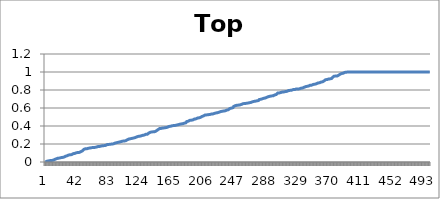
| Category | Top Slice |
|---|---|
| 0 | 0 |
| 1 | 0.006 |
| 2 | 0.009 |
| 3 | 0.01 |
| 4 | 0.012 |
| 5 | 0.014 |
| 6 | 0.015 |
| 7 | 0.017 |
| 8 | 0.017 |
| 9 | 0.019 |
| 10 | 0.02 |
| 11 | 0.022 |
| 12 | 0.028 |
| 13 | 0.029 |
| 14 | 0.036 |
| 15 | 0.036 |
| 16 | 0.042 |
| 17 | 0.042 |
| 18 | 0.043 |
| 19 | 0.045 |
| 20 | 0.048 |
| 21 | 0.048 |
| 22 | 0.051 |
| 23 | 0.054 |
| 24 | 0.054 |
| 25 | 0.063 |
| 26 | 0.064 |
| 27 | 0.069 |
| 28 | 0.069 |
| 29 | 0.075 |
| 30 | 0.077 |
| 31 | 0.078 |
| 32 | 0.081 |
| 33 | 0.081 |
| 34 | 0.082 |
| 35 | 0.086 |
| 36 | 0.093 |
| 37 | 0.094 |
| 38 | 0.095 |
| 39 | 0.096 |
| 40 | 0.102 |
| 41 | 0.104 |
| 42 | 0.105 |
| 43 | 0.106 |
| 44 | 0.107 |
| 45 | 0.112 |
| 46 | 0.116 |
| 47 | 0.118 |
| 48 | 0.124 |
| 49 | 0.129 |
| 50 | 0.141 |
| 51 | 0.143 |
| 52 | 0.148 |
| 53 | 0.148 |
| 54 | 0.148 |
| 55 | 0.15 |
| 56 | 0.153 |
| 57 | 0.154 |
| 58 | 0.156 |
| 59 | 0.156 |
| 60 | 0.159 |
| 61 | 0.16 |
| 62 | 0.161 |
| 63 | 0.162 |
| 64 | 0.162 |
| 65 | 0.164 |
| 66 | 0.166 |
| 67 | 0.168 |
| 68 | 0.171 |
| 69 | 0.172 |
| 70 | 0.173 |
| 71 | 0.176 |
| 72 | 0.176 |
| 73 | 0.179 |
| 74 | 0.18 |
| 75 | 0.182 |
| 76 | 0.182 |
| 77 | 0.182 |
| 78 | 0.185 |
| 79 | 0.193 |
| 80 | 0.193 |
| 81 | 0.194 |
| 82 | 0.195 |
| 83 | 0.196 |
| 84 | 0.197 |
| 85 | 0.197 |
| 86 | 0.2 |
| 87 | 0.202 |
| 88 | 0.202 |
| 89 | 0.209 |
| 90 | 0.209 |
| 91 | 0.213 |
| 92 | 0.214 |
| 93 | 0.218 |
| 94 | 0.218 |
| 95 | 0.221 |
| 96 | 0.222 |
| 97 | 0.224 |
| 98 | 0.227 |
| 99 | 0.231 |
| 100 | 0.232 |
| 101 | 0.233 |
| 102 | 0.233 |
| 103 | 0.234 |
| 104 | 0.236 |
| 105 | 0.247 |
| 106 | 0.247 |
| 107 | 0.252 |
| 108 | 0.255 |
| 109 | 0.258 |
| 110 | 0.258 |
| 111 | 0.262 |
| 112 | 0.262 |
| 113 | 0.265 |
| 114 | 0.266 |
| 115 | 0.27 |
| 116 | 0.27 |
| 117 | 0.273 |
| 118 | 0.277 |
| 119 | 0.278 |
| 120 | 0.284 |
| 121 | 0.285 |
| 122 | 0.286 |
| 123 | 0.287 |
| 124 | 0.29 |
| 125 | 0.293 |
| 126 | 0.297 |
| 127 | 0.298 |
| 128 | 0.299 |
| 129 | 0.304 |
| 130 | 0.307 |
| 131 | 0.308 |
| 132 | 0.308 |
| 133 | 0.309 |
| 134 | 0.322 |
| 135 | 0.33 |
| 136 | 0.331 |
| 137 | 0.333 |
| 138 | 0.334 |
| 139 | 0.334 |
| 140 | 0.336 |
| 141 | 0.337 |
| 142 | 0.338 |
| 143 | 0.34 |
| 144 | 0.348 |
| 145 | 0.352 |
| 146 | 0.361 |
| 147 | 0.367 |
| 148 | 0.372 |
| 149 | 0.373 |
| 150 | 0.373 |
| 151 | 0.375 |
| 152 | 0.377 |
| 153 | 0.378 |
| 154 | 0.379 |
| 155 | 0.38 |
| 156 | 0.382 |
| 157 | 0.384 |
| 158 | 0.386 |
| 159 | 0.388 |
| 160 | 0.395 |
| 161 | 0.396 |
| 162 | 0.397 |
| 163 | 0.399 |
| 164 | 0.402 |
| 165 | 0.403 |
| 166 | 0.405 |
| 167 | 0.405 |
| 168 | 0.406 |
| 169 | 0.407 |
| 170 | 0.41 |
| 171 | 0.413 |
| 172 | 0.414 |
| 173 | 0.416 |
| 174 | 0.419 |
| 175 | 0.42 |
| 176 | 0.423 |
| 177 | 0.425 |
| 178 | 0.425 |
| 179 | 0.43 |
| 180 | 0.432 |
| 181 | 0.433 |
| 182 | 0.436 |
| 183 | 0.449 |
| 184 | 0.452 |
| 185 | 0.453 |
| 186 | 0.461 |
| 187 | 0.463 |
| 188 | 0.464 |
| 189 | 0.464 |
| 190 | 0.466 |
| 191 | 0.467 |
| 192 | 0.473 |
| 193 | 0.477 |
| 194 | 0.478 |
| 195 | 0.479 |
| 196 | 0.48 |
| 197 | 0.488 |
| 198 | 0.489 |
| 199 | 0.491 |
| 200 | 0.495 |
| 201 | 0.496 |
| 202 | 0.505 |
| 203 | 0.507 |
| 204 | 0.51 |
| 205 | 0.513 |
| 206 | 0.523 |
| 207 | 0.523 |
| 208 | 0.523 |
| 209 | 0.524 |
| 210 | 0.524 |
| 211 | 0.526 |
| 212 | 0.527 |
| 213 | 0.528 |
| 214 | 0.531 |
| 215 | 0.533 |
| 216 | 0.534 |
| 217 | 0.534 |
| 218 | 0.538 |
| 219 | 0.54 |
| 220 | 0.541 |
| 221 | 0.545 |
| 222 | 0.546 |
| 223 | 0.547 |
| 224 | 0.549 |
| 225 | 0.553 |
| 226 | 0.558 |
| 227 | 0.56 |
| 228 | 0.562 |
| 229 | 0.564 |
| 230 | 0.566 |
| 231 | 0.567 |
| 232 | 0.569 |
| 233 | 0.569 |
| 234 | 0.572 |
| 235 | 0.577 |
| 236 | 0.58 |
| 237 | 0.581 |
| 238 | 0.592 |
| 239 | 0.595 |
| 240 | 0.596 |
| 241 | 0.599 |
| 242 | 0.602 |
| 243 | 0.604 |
| 244 | 0.618 |
| 245 | 0.621 |
| 246 | 0.626 |
| 247 | 0.63 |
| 248 | 0.63 |
| 249 | 0.63 |
| 250 | 0.632 |
| 251 | 0.633 |
| 252 | 0.635 |
| 253 | 0.638 |
| 254 | 0.64 |
| 255 | 0.648 |
| 256 | 0.648 |
| 257 | 0.649 |
| 258 | 0.649 |
| 259 | 0.65 |
| 260 | 0.652 |
| 261 | 0.652 |
| 262 | 0.654 |
| 263 | 0.657 |
| 264 | 0.658 |
| 265 | 0.659 |
| 266 | 0.661 |
| 267 | 0.664 |
| 268 | 0.668 |
| 269 | 0.67 |
| 270 | 0.673 |
| 271 | 0.675 |
| 272 | 0.676 |
| 273 | 0.679 |
| 274 | 0.68 |
| 275 | 0.681 |
| 276 | 0.682 |
| 277 | 0.694 |
| 278 | 0.696 |
| 279 | 0.697 |
| 280 | 0.699 |
| 281 | 0.702 |
| 282 | 0.707 |
| 283 | 0.708 |
| 284 | 0.709 |
| 285 | 0.712 |
| 286 | 0.714 |
| 287 | 0.72 |
| 288 | 0.721 |
| 289 | 0.726 |
| 290 | 0.728 |
| 291 | 0.73 |
| 292 | 0.731 |
| 293 | 0.735 |
| 294 | 0.735 |
| 295 | 0.735 |
| 296 | 0.742 |
| 297 | 0.745 |
| 298 | 0.748 |
| 299 | 0.75 |
| 300 | 0.759 |
| 301 | 0.767 |
| 302 | 0.767 |
| 303 | 0.767 |
| 304 | 0.767 |
| 305 | 0.773 |
| 306 | 0.777 |
| 307 | 0.777 |
| 308 | 0.778 |
| 309 | 0.779 |
| 310 | 0.782 |
| 311 | 0.783 |
| 312 | 0.784 |
| 313 | 0.786 |
| 314 | 0.79 |
| 315 | 0.794 |
| 316 | 0.795 |
| 317 | 0.796 |
| 318 | 0.796 |
| 319 | 0.798 |
| 320 | 0.799 |
| 321 | 0.805 |
| 322 | 0.805 |
| 323 | 0.805 |
| 324 | 0.807 |
| 325 | 0.811 |
| 326 | 0.812 |
| 327 | 0.812 |
| 328 | 0.812 |
| 329 | 0.813 |
| 330 | 0.819 |
| 331 | 0.82 |
| 332 | 0.821 |
| 333 | 0.822 |
| 334 | 0.826 |
| 335 | 0.829 |
| 336 | 0.834 |
| 337 | 0.837 |
| 338 | 0.84 |
| 339 | 0.841 |
| 340 | 0.842 |
| 341 | 0.845 |
| 342 | 0.848 |
| 343 | 0.853 |
| 344 | 0.853 |
| 345 | 0.854 |
| 346 | 0.856 |
| 347 | 0.862 |
| 348 | 0.863 |
| 349 | 0.864 |
| 350 | 0.868 |
| 351 | 0.869 |
| 352 | 0.878 |
| 353 | 0.879 |
| 354 | 0.879 |
| 355 | 0.879 |
| 356 | 0.885 |
| 357 | 0.888 |
| 358 | 0.888 |
| 359 | 0.891 |
| 360 | 0.895 |
| 361 | 0.901 |
| 362 | 0.909 |
| 363 | 0.915 |
| 364 | 0.915 |
| 365 | 0.916 |
| 366 | 0.916 |
| 367 | 0.922 |
| 368 | 0.923 |
| 369 | 0.924 |
| 370 | 0.925 |
| 371 | 0.929 |
| 372 | 0.941 |
| 373 | 0.942 |
| 374 | 0.954 |
| 375 | 0.954 |
| 376 | 0.954 |
| 377 | 0.955 |
| 378 | 0.956 |
| 379 | 0.965 |
| 380 | 0.965 |
| 381 | 0.972 |
| 382 | 0.977 |
| 383 | 0.98 |
| 384 | 0.983 |
| 385 | 0.985 |
| 386 | 0.987 |
| 387 | 0.992 |
| 388 | 0.996 |
| 389 | 0.997 |
| 390 | 0.998 |
| 391 | 0.999 |
| 392 | 1 |
| 393 | 1 |
| 394 | 1 |
| 395 | 1 |
| 396 | 1 |
| 397 | 1 |
| 398 | 1 |
| 399 | 1 |
| 400 | 1 |
| 401 | 1 |
| 402 | 1 |
| 403 | 1 |
| 404 | 1 |
| 405 | 1 |
| 406 | 1 |
| 407 | 1 |
| 408 | 1 |
| 409 | 1 |
| 410 | 1 |
| 411 | 1 |
| 412 | 1 |
| 413 | 1 |
| 414 | 1 |
| 415 | 1 |
| 416 | 1 |
| 417 | 1 |
| 418 | 1 |
| 419 | 1 |
| 420 | 1 |
| 421 | 1 |
| 422 | 1 |
| 423 | 1 |
| 424 | 1 |
| 425 | 1 |
| 426 | 1 |
| 427 | 1 |
| 428 | 1 |
| 429 | 1 |
| 430 | 1 |
| 431 | 1 |
| 432 | 1 |
| 433 | 1 |
| 434 | 1 |
| 435 | 1 |
| 436 | 1 |
| 437 | 1 |
| 438 | 1 |
| 439 | 1 |
| 440 | 1 |
| 441 | 1 |
| 442 | 1 |
| 443 | 1 |
| 444 | 1 |
| 445 | 1 |
| 446 | 1 |
| 447 | 1 |
| 448 | 1 |
| 449 | 1 |
| 450 | 1 |
| 451 | 1 |
| 452 | 1 |
| 453 | 1 |
| 454 | 1 |
| 455 | 1 |
| 456 | 1 |
| 457 | 1 |
| 458 | 1 |
| 459 | 1 |
| 460 | 1 |
| 461 | 1 |
| 462 | 1 |
| 463 | 1 |
| 464 | 1 |
| 465 | 1 |
| 466 | 1 |
| 467 | 1 |
| 468 | 1 |
| 469 | 1 |
| 470 | 1 |
| 471 | 1 |
| 472 | 1 |
| 473 | 1 |
| 474 | 1 |
| 475 | 1 |
| 476 | 1 |
| 477 | 1 |
| 478 | 1 |
| 479 | 1 |
| 480 | 1 |
| 481 | 1 |
| 482 | 1 |
| 483 | 1 |
| 484 | 1 |
| 485 | 1 |
| 486 | 1 |
| 487 | 1 |
| 488 | 1 |
| 489 | 1 |
| 490 | 1 |
| 491 | 1 |
| 492 | 1 |
| 493 | 1 |
| 494 | 1 |
| 495 | 1 |
| 496 | 1 |
| 497 | 1 |
| 498 | 1 |
| 499 | 1 |